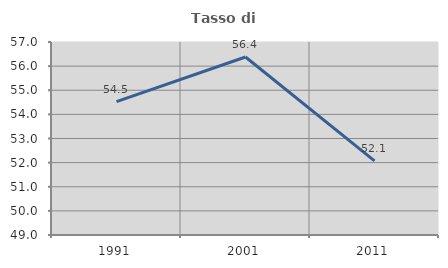
| Category | Tasso di occupazione   |
|---|---|
| 1991.0 | 54.528 |
| 2001.0 | 56.377 |
| 2011.0 | 52.075 |